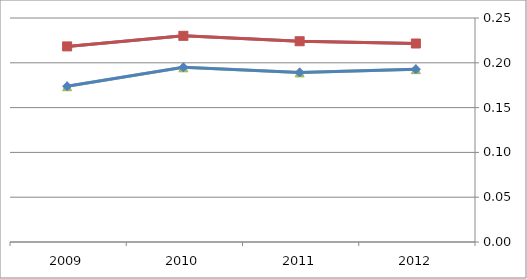
| Category | TELUS | ROGERS |
|---|---|---|
| 2012.0 | 0.193 | 0.222 |
| 2011.0 | 0.189 | 0.224 |
| 2010.0 | 0.195 | 0.23 |
| 2009.0 | 0.174 | 0.218 |